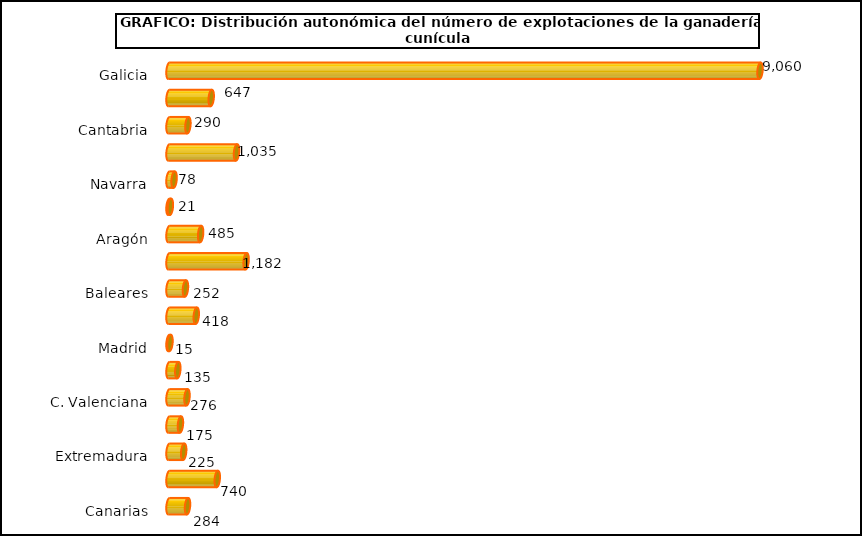
| Category | num. Explotaciones |
|---|---|
|   Galicia | 9060 |
|   P. de Asturias | 647 |
|   Cantabria | 290 |
|   País Vasco | 1035 |
|   Navarra | 78 |
|   La Rioja | 21 |
|   Aragón | 485 |
|   Cataluña | 1182 |
|   Baleares | 252 |
|   Castilla y León | 418 |
|   Madrid | 15 |
|   Castilla – La Mancha | 135 |
|   C. Valenciana | 276 |
|   R. de Murcia | 175 |
|   Extremadura | 225 |
|   Andalucía | 740 |
|   Canarias | 284 |